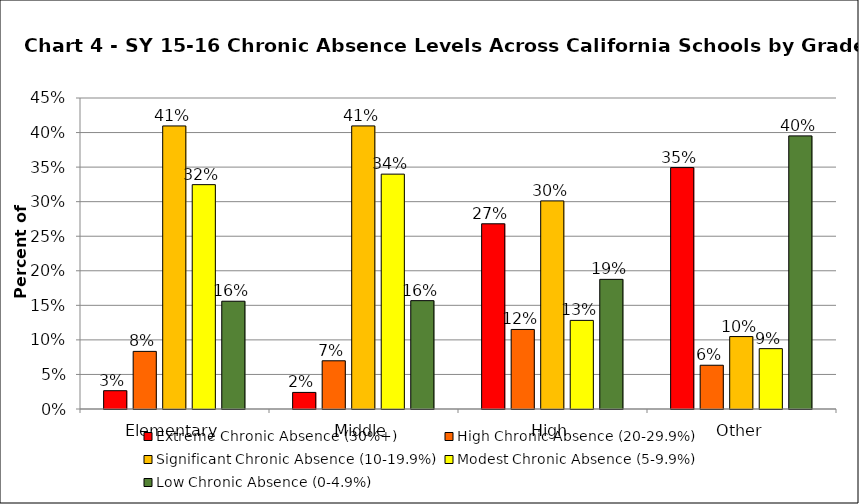
| Category | Extreme Chronic Absence (30%+) | High Chronic Absence (20-29.9%) | Significant Chronic Absence (10-19.9%) | Modest Chronic Absence (5-9.9%) | Low Chronic Absence (0-4.9%) |
|---|---|---|---|---|---|
| 0 | 0.026 | 0.083 | 0.41 | 0.325 | 0.156 |
| 1 | 0.024 | 0.07 | 0.41 | 0.34 | 0.157 |
| 2 | 0.268 | 0.115 | 0.301 | 0.128 | 0.188 |
| 3 | 0.349 | 0.063 | 0.105 | 0.087 | 0.395 |